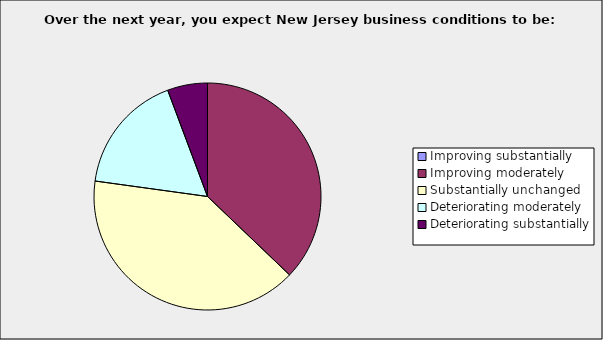
| Category | Series 0 |
|---|---|
| Improving substantially | 0 |
| Improving moderately | 0.371 |
| Substantially unchanged | 0.4 |
| Deteriorating moderately | 0.171 |
| Deteriorating substantially | 0.057 |